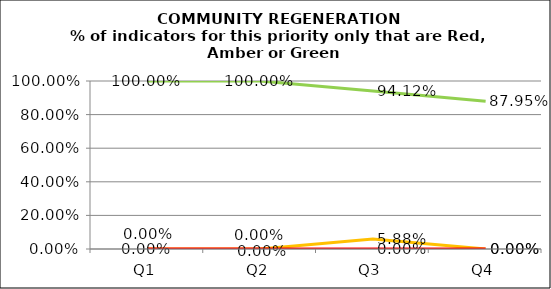
| Category | Green | Amber | Red |
|---|---|---|---|
| Q1 | 1 | 0 | 0 |
| Q2 | 1 | 0 | 0 |
| Q3 | 0.941 | 0.059 | 0 |
| Q4 | 0.879 | 0 | 0 |